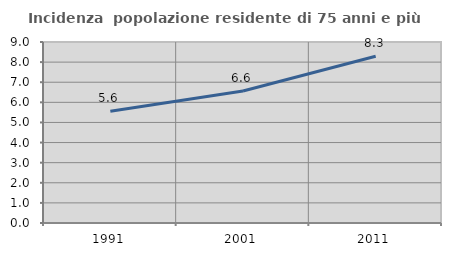
| Category | Incidenza  popolazione residente di 75 anni e più |
|---|---|
| 1991.0 | 5.561 |
| 2001.0 | 6.561 |
| 2011.0 | 8.29 |